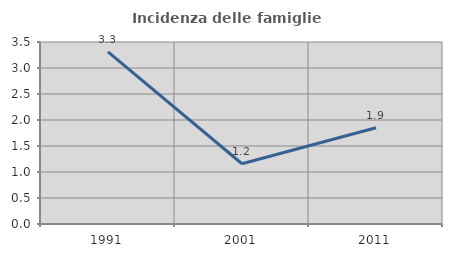
| Category | Incidenza delle famiglie numerose |
|---|---|
| 1991.0 | 3.311 |
| 2001.0 | 1.158 |
| 2011.0 | 1.852 |